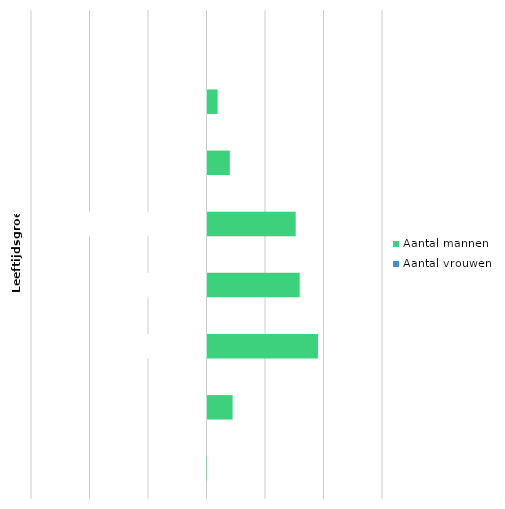
| Category | Aantal mannen | Aantal vrouwen |
|---|---|---|
| 65j+ | 20 | -3 |
| 60-64j | 893 | -403 |
| 50-59j | 3812 | -3326 |
| 40-49j | 3187 | -3647 |
| 30-39j | 3050 | -4043 |
| 26-29j | 797 | -1116 |
| 18-25j | 380 | -523 |
| 12-17j | 0 | 0 |